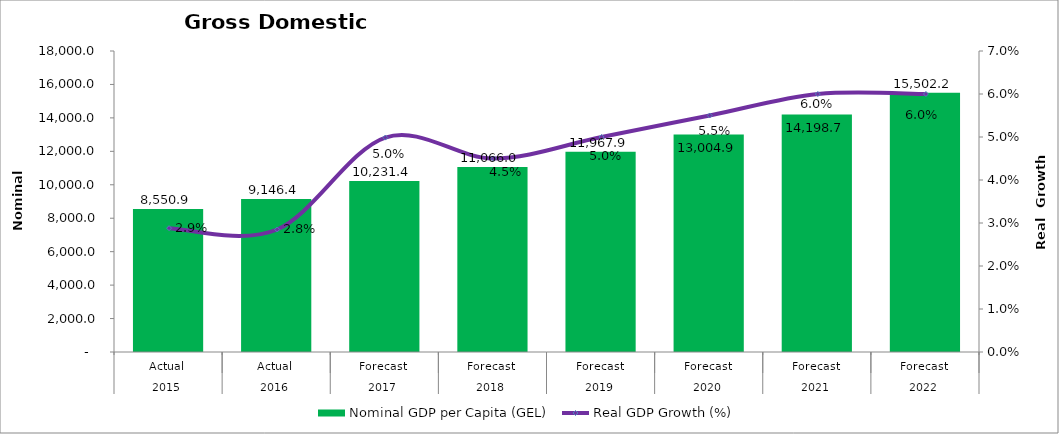
| Category | Nominal GDP per Capita (GEL) |
|---|---|
| 0 | 8550.921 |
| 1 | 9146.45 |
| 2 | 10231.353 |
| 3 | 11065.977 |
| 4 | 11967.854 |
| 5 | 13004.871 |
| 6 | 14198.714 |
| 7 | 15502.155 |